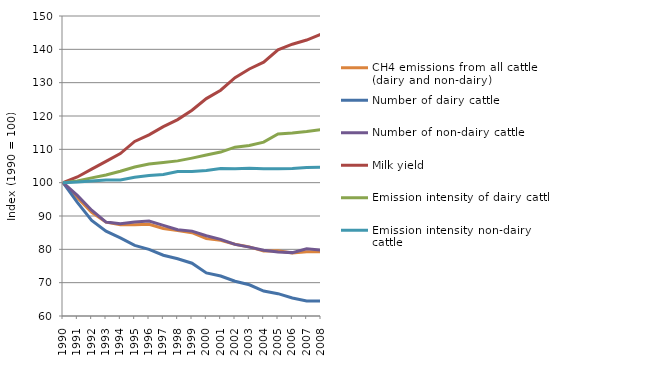
| Category | CH4 emissions from all cattle (dairy and non-dairy) | Number of dairy cattle | Number of non-dairy cattle | Milk yield | Emission intensity of dairy cattle | Emission intensity non-dairy cattle |
|---|---|---|---|---|---|---|
| 1990.0 | 100 | 100 | 100 | 100 | 100 | 100 |
| 1991.0 | 95.51 | 94.066 | 96.185 | 101.698 | 100.509 | 100.234 |
| 1992.0 | 91.112 | 88.666 | 91.737 | 104.059 | 101.434 | 100.514 |
| 1993.0 | 88.149 | 85.456 | 88.166 | 106.395 | 102.28 | 100.769 |
| 1994.0 | 87.374 | 83.457 | 87.644 | 108.724 | 103.41 | 100.833 |
| 1995.0 | 87.386 | 81.176 | 88.215 | 112.361 | 104.679 | 101.613 |
| 1996.0 | 87.538 | 79.973 | 88.514 | 114.351 | 105.582 | 102.169 |
| 1997.0 | 86.243 | 78.234 | 87.189 | 116.813 | 106.021 | 102.447 |
| 1998.0 | 85.622 | 77.186 | 85.89 | 118.919 | 106.54 | 103.369 |
| 1999.0 | 84.989 | 75.833 | 85.469 | 121.72 | 107.371 | 103.334 |
| 2000.0 | 83.208 | 72.935 | 84.062 | 125.224 | 108.283 | 103.684 |
| 2001.0 | 82.689 | 71.995 | 83.004 | 127.737 | 109.172 | 104.223 |
| 2002.0 | 81.514 | 70.419 | 81.482 | 131.503 | 110.644 | 104.163 |
| 2003.0 | 80.744 | 69.363 | 80.668 | 134.115 | 111.155 | 104.311 |
| 2004.0 | 79.466 | 67.471 | 79.702 | 136.167 | 112.156 | 104.147 |
| 2005.0 | 79.576 | 66.695 | 79.18 | 139.87 | 114.629 | 104.183 |
| 2006.0 | 78.877 | 65.419 | 79.014 | 141.544 | 114.872 | 104.231 |
| 2007.0 | 79.265 | 64.535 | 80.151 | 142.78 | 115.33 | 104.528 |
| 2008.0 | 79.252 | 64.489 | 79.783 | 144.535 | 115.907 | 104.606 |